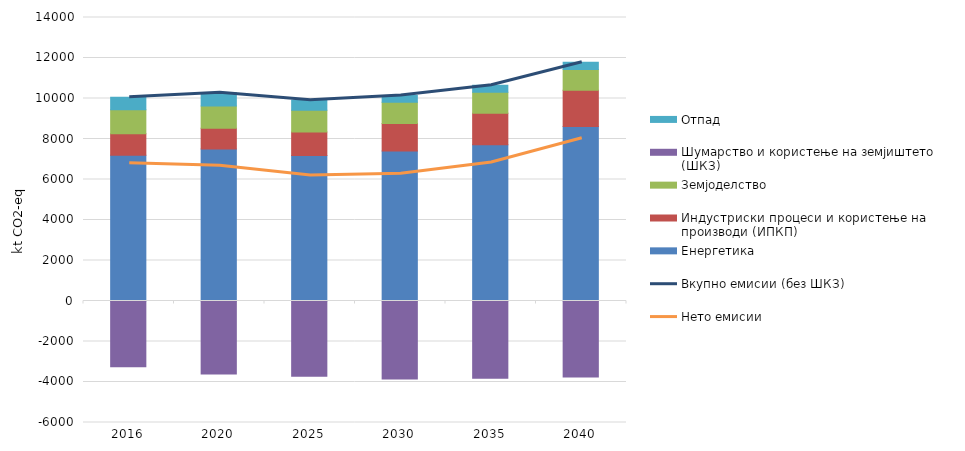
| Category | Енергетика  | Индустриски процеси и користење на производи (ИПКП) | Земјоделство | Шумарство и користење на земјиштето (ШКЗ) | Отпад |
|---|---|---|---|---|---|
| 2016.0 | 7201 | 1056 | 1191 | -3253 | 610 |
| 2020.0 | 7512 | 1024 | 1093 | -3604 | 659 |
| 2025.0 | 7185 | 1163 | 1075 | -3719 | 492 |
| 2030.0 | 7413 | 1352 | 1055 | -3855 | 323 |
| 2035.0 | 7711 | 1562 | 1036 | -3813 | 345 |
| 2040.0 | 8614 | 1792 | 1021 | -3754 | 366 |